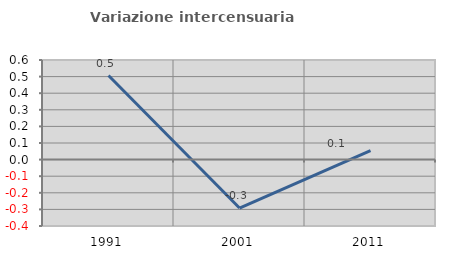
| Category | Variazione intercensuaria annua |
|---|---|
| 1991.0 | 0.506 |
| 2001.0 | -0.292 |
| 2011.0 | 0.054 |